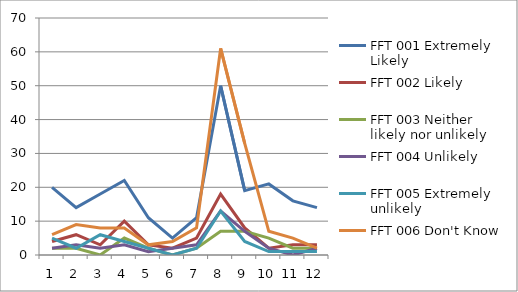
| Category | FFT 001 Extremely Likely | FFT 002 Likely | FFT 003 Neither likely nor unlikely | FFT 004 Unlikely | FFT 005 Extremely unlikely | FFT 006 Don't Know |
|---|---|---|---|---|---|---|
| 0 | 20 | 4 | 2 | 2 | 5 | 6 |
| 1 | 14 | 6 | 2 | 3 | 2 | 9 |
| 2 | 18 | 3 | 0 | 2 | 6 | 8 |
| 3 | 22 | 10 | 5 | 3 | 4 | 8 |
| 4 | 11 | 3 | 2 | 1 | 2 | 3 |
| 5 | 5 | 2 | 0 | 2 | 0 | 4 |
| 6 | 11 | 5 | 2 | 3 | 2 | 8 |
| 7 | 50 | 18 | 7 | 13 | 13 | 61 |
| 8 | 19 | 8 | 7 | 7 | 4 | 33 |
| 9 | 21 | 2 | 5 | 2 | 1 | 7 |
| 10 | 16 | 3 | 2 | 0 | 1 | 5 |
| 11 | 14 | 3 | 2 | 2 | 1 | 2 |